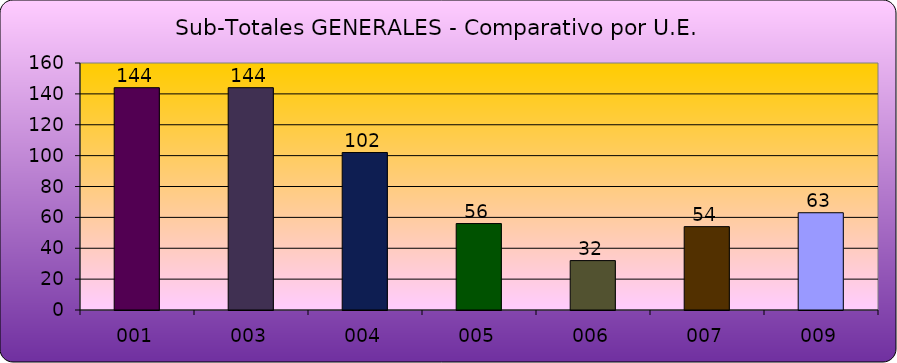
| Category | Sub-Totales por U.E. |
|---|---|
| 001 | 144 |
| 003 | 144 |
| 004 | 102 |
| 005 | 56 |
| 006 | 32 |
| 007 | 54 |
| 009 | 63 |